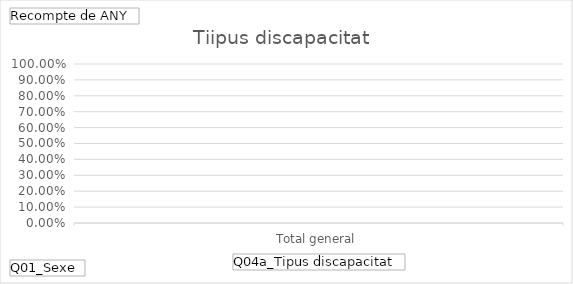
| Category | Total general |
|---|---|
| Total general | 0 |